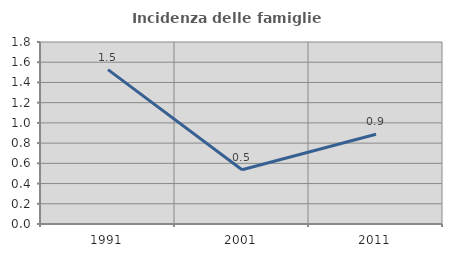
| Category | Incidenza delle famiglie numerose |
|---|---|
| 1991.0 | 1.527 |
| 2001.0 | 0.537 |
| 2011.0 | 0.887 |